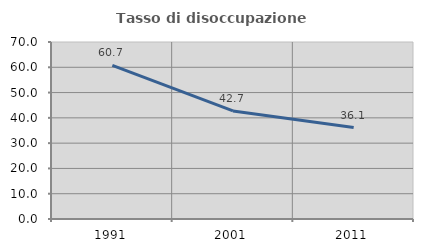
| Category | Tasso di disoccupazione giovanile  |
|---|---|
| 1991.0 | 60.733 |
| 2001.0 | 42.735 |
| 2011.0 | 36.145 |